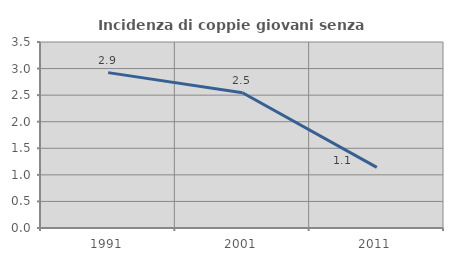
| Category | Incidenza di coppie giovani senza figli |
|---|---|
| 1991.0 | 2.924 |
| 2001.0 | 2.544 |
| 2011.0 | 1.141 |